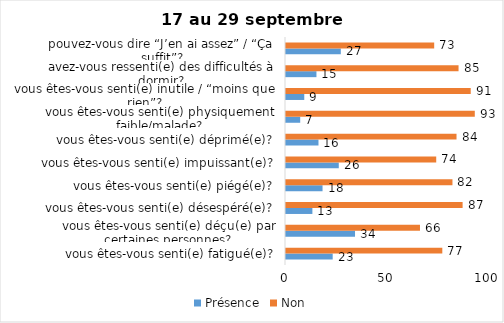
| Category | Présence | Non |
|---|---|---|
| vous êtes-vous senti(e) fatigué(e)? | 23 | 77 |
| vous êtes-vous senti(e) déçu(e) par certaines personnes? | 34 | 66 |
| vous êtes-vous senti(e) désespéré(e)? | 13 | 87 |
| vous êtes-vous senti(e) piégé(e)? | 18 | 82 |
| vous êtes-vous senti(e) impuissant(e)? | 26 | 74 |
| vous êtes-vous senti(e) déprimé(e)? | 16 | 84 |
| vous êtes-vous senti(e) physiquement faible/malade? | 7 | 93 |
| vous êtes-vous senti(e) inutile / “moins que rien”? | 9 | 91 |
| avez-vous ressenti(e) des difficultés à dormir? | 15 | 85 |
| pouvez-vous dire “J’en ai assez” / “Ça suffit”? | 27 | 73 |